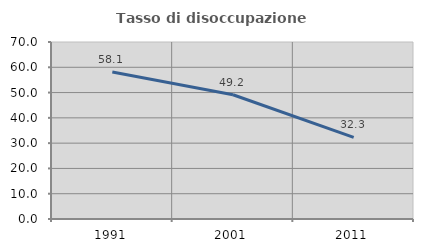
| Category | Tasso di disoccupazione giovanile  |
|---|---|
| 1991.0 | 58.115 |
| 2001.0 | 49.153 |
| 2011.0 | 32.258 |